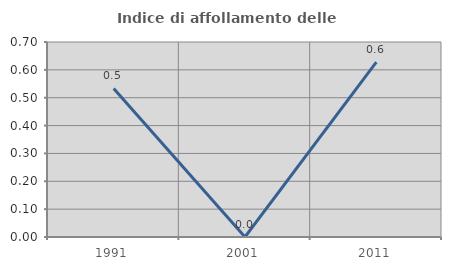
| Category | Indice di affollamento delle abitazioni  |
|---|---|
| 1991.0 | 0.533 |
| 2001.0 | 0 |
| 2011.0 | 0.628 |